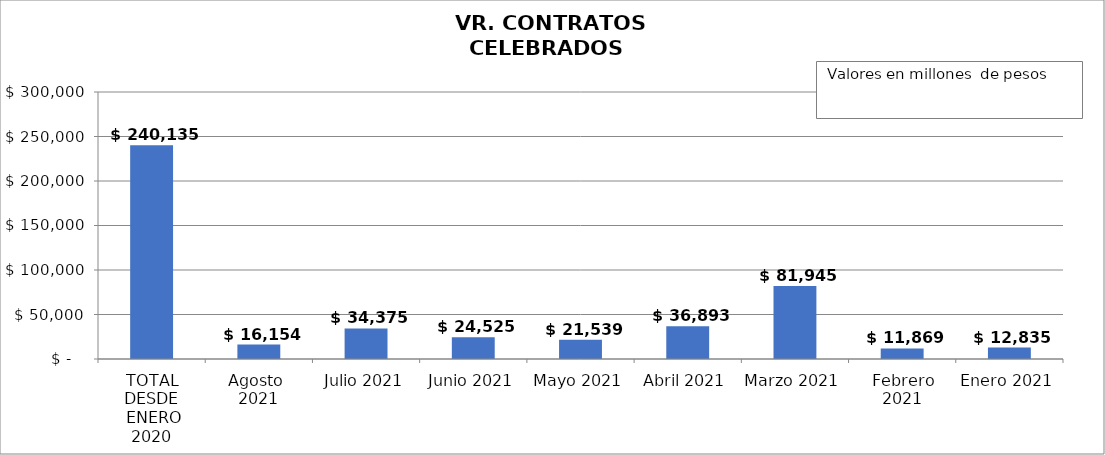
| Category | TOTAL EN ANTIOQUIA |
|---|---|
| TOTAL DESDE
 ENERO 2020 | 240134.647 |
| Agosto  2021 | 16153.845 |
| Julio 2021 | 34375.424 |
| Junio 2021 | 24524.592 |
| Mayo 2021 | 21539.214 |
| Abril 2021 | 36893.443 |
| Marzo 2021 | 81944.83 |
| Febrero 2021 | 11868.58 |
| Enero 2021 | 12834.718 |